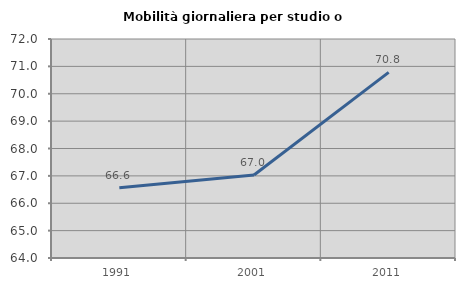
| Category | Mobilità giornaliera per studio o lavoro |
|---|---|
| 1991.0 | 66.564 |
| 2001.0 | 67.032 |
| 2011.0 | 70.781 |